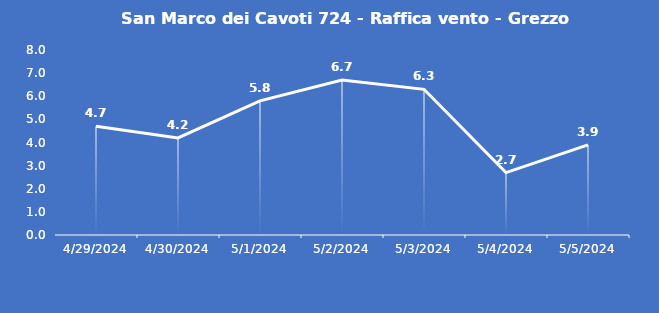
| Category | San Marco dei Cavoti 724 - Raffica vento - Grezzo (m/s) |
|---|---|
| 4/29/24 | 4.7 |
| 4/30/24 | 4.2 |
| 5/1/24 | 5.8 |
| 5/2/24 | 6.7 |
| 5/3/24 | 6.3 |
| 5/4/24 | 2.7 |
| 5/5/24 | 3.9 |